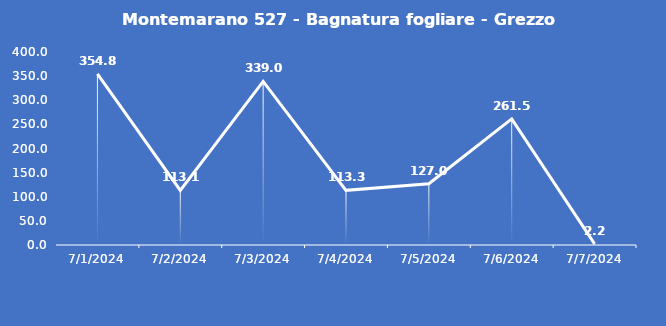
| Category | Montemarano 527 - Bagnatura fogliare - Grezzo (min) |
|---|---|
| 7/1/24 | 354.8 |
| 7/2/24 | 113.1 |
| 7/3/24 | 339 |
| 7/4/24 | 113.3 |
| 7/5/24 | 127 |
| 7/6/24 | 261.5 |
| 7/7/24 | 2.2 |